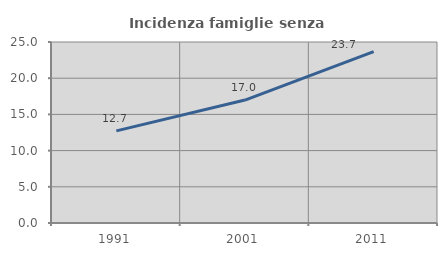
| Category | Incidenza famiglie senza nuclei |
|---|---|
| 1991.0 | 12.727 |
| 2001.0 | 16.982 |
| 2011.0 | 23.669 |